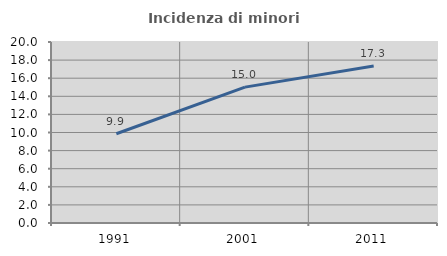
| Category | Incidenza di minori stranieri |
|---|---|
| 1991.0 | 9.859 |
| 2001.0 | 15.016 |
| 2011.0 | 17.349 |